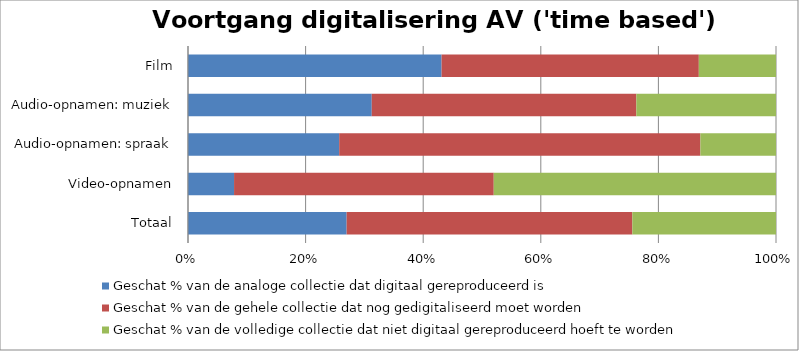
| Category | Geschat % van de analoge collectie dat digitaal gereproduceerd is  | Geschat % van de gehele collectie dat nog gedigitaliseerd moet worden | Geschat % van de volledige collectie dat niet digitaal gereproduceerd hoeft te worden |
|---|---|---|---|
| Totaal | 26.981 | 48.586 | 24.433 |
| Video-opnamen | 7.833 | 44.167 | 48 |
| Audio-opnamen: spraak | 25.714 | 61.429 | 12.857 |
| Audio-opnamen: muziek | 31.25 | 45 | 23.75 |
| Film | 43.125 | 43.75 | 13.125 |